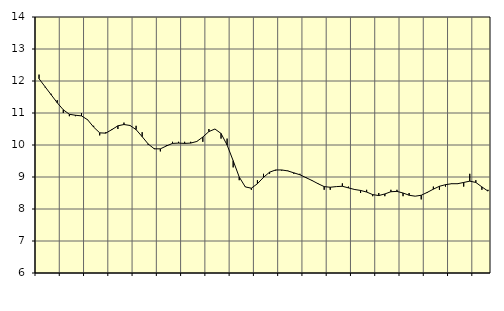
| Category | Piggar | Tillverkning av verkstadsvaror, SNI 25-30, 33 |
|---|---|---|
| nan | 12.2 | 12.07 |
| 1.0 | 11.8 | 11.82 |
| 1.0 | 11.6 | 11.57 |
| 1.0 | 11.4 | 11.32 |
| nan | 11 | 11.1 |
| 2.0 | 10.9 | 10.96 |
| 2.0 | 10.9 | 10.93 |
| 2.0 | 11 | 10.91 |
| nan | 10.8 | 10.79 |
| 3.0 | 10.6 | 10.56 |
| 3.0 | 10.3 | 10.38 |
| 3.0 | 10.4 | 10.37 |
| nan | 10.5 | 10.48 |
| 4.0 | 10.5 | 10.6 |
| 4.0 | 10.7 | 10.64 |
| 4.0 | 10.6 | 10.61 |
| nan | 10.6 | 10.48 |
| 5.0 | 10.4 | 10.26 |
| 5.0 | 10 | 10.03 |
| 5.0 | 9.9 | 9.88 |
| nan | 9.8 | 9.88 |
| 6.0 | 10 | 9.97 |
| 6.0 | 10.1 | 10.05 |
| 6.0 | 10.1 | 10.06 |
| nan | 10.1 | 10.05 |
| 7.0 | 10.1 | 10.06 |
| 7.0 | 10.1 | 10.11 |
| 7.0 | 10.1 | 10.25 |
| nan | 10.5 | 10.42 |
| 8.0 | 10.5 | 10.5 |
| 8.0 | 10.2 | 10.36 |
| 8.0 | 10.2 | 10 |
| nan | 9.3 | 9.51 |
| 9.0 | 8.9 | 9 |
| 9.0 | 8.7 | 8.69 |
| 9.0 | 8.6 | 8.65 |
| nan | 8.9 | 8.79 |
| 10.0 | 9.1 | 8.99 |
| 10.0 | 9.1 | 9.15 |
| 10.0 | 9.2 | 9.22 |
| nan | 9.2 | 9.22 |
| 11.0 | 9.2 | 9.19 |
| 11.0 | 9.1 | 9.13 |
| 11.0 | 9.1 | 9.07 |
| nan | 9 | 8.98 |
| 12.0 | 8.9 | 8.89 |
| 12.0 | 8.8 | 8.79 |
| 12.0 | 8.6 | 8.7 |
| nan | 8.6 | 8.68 |
| 13.0 | 8.7 | 8.7 |
| 13.0 | 8.8 | 8.71 |
| 13.0 | 8.7 | 8.66 |
| nan | 8.6 | 8.61 |
| 14.0 | 8.5 | 8.58 |
| 14.0 | 8.6 | 8.53 |
| 14.0 | 8.4 | 8.45 |
| nan | 8.5 | 8.42 |
| 15.0 | 8.4 | 8.47 |
| 15.0 | 8.6 | 8.54 |
| 15.0 | 8.6 | 8.55 |
| nan | 8.4 | 8.5 |
| 16.0 | 8.5 | 8.43 |
| 16.0 | 8.4 | 8.4 |
| 16.0 | 8.3 | 8.43 |
| nan | 8.5 | 8.52 |
| 17.0 | 8.7 | 8.62 |
| 17.0 | 8.6 | 8.71 |
| 17.0 | 8.7 | 8.76 |
| nan | 8.8 | 8.79 |
| 18.0 | 8.8 | 8.79 |
| 18.0 | 8.7 | 8.83 |
| 18.0 | 9.1 | 8.87 |
| nan | 8.9 | 8.83 |
| 19.0 | 8.6 | 8.69 |
| 19.0 | 8.6 | 8.56 |